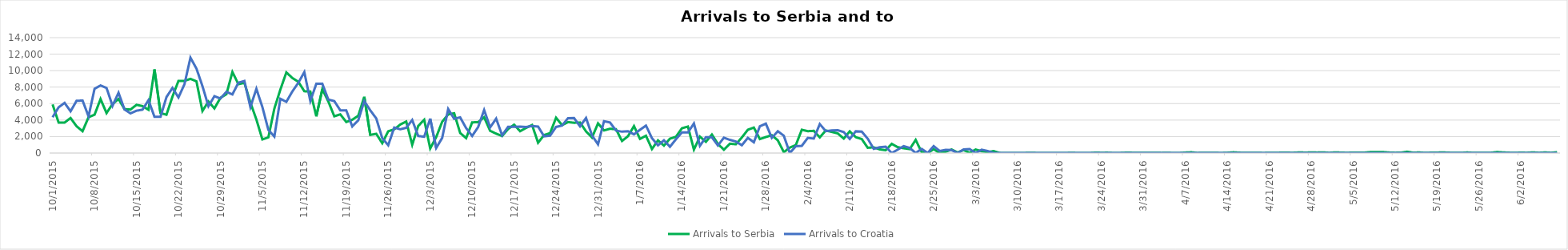
| Category | Arrivals to Serbia | Arrivals to Croatia |
|---|---|---|
| 10/1/15 | 5900 | 4344 |
| 10/2/15 | 3700 | 5546 |
| 10/3/15 | 3700 | 6086 |
| 10/4/15 | 4250 | 5065 |
| 10/5/15 | 3250 | 6338 |
| 10/6/15 | 2650 | 6370 |
| 10/7/15 | 4350 | 4446 |
| 10/8/15 | 4650 | 7798 |
| 10/9/15 | 6550 | 8201 |
| 10/10/15 | 4850 | 7896 |
| 10/11/15 | 5950 | 5732 |
| 10/12/15 | 6556 | 7317 |
| 10/13/15 | 5330 | 5286 |
| 10/14/15 | 5280 | 4814 |
| 10/15/15 | 5850 | 5138 |
| 10/16/15 | 5700 | 5260 |
| 10/17/15 | 5250 | 6415 |
| 10/18/15 | 10150 | 4390 |
| 10/19/15 | 4850 | 4388 |
| 10/20/15 | 4650 | 6793 |
| 10/21/15 | 6850 | 7900 |
| 10/22/15 | 8750 | 6748 |
| 10/23/15 | 8750 | 8348 |
| 10/24/15 | 9000 | 11570 |
| 10/25/15 | 8700 | 10249 |
| 10/26/15 | 5100 | 8128 |
| 10/27/15 | 6257 | 5683 |
| 10/28/15 | 5415 | 6900 |
| 10/29/15 | 6700 | 6615 |
| 10/30/15 | 7138 | 7429 |
| 10/31/15 | 9834 | 7110 |
| 11/1/15 | 8354 | 8534 |
| 11/2/15 | 8521 | 8746 |
| 11/3/15 | 6129 | 5573 |
| 11/4/15 | 4073 | 7792 |
| 11/5/15 | 1652 | 5587 |
| 11/6/15 | 1906 | 2809 |
| 11/7/15 | 5397 | 2000 |
| 11/8/15 | 7695 | 6579 |
| 11/9/15 | 9785 | 6214 |
| 11/10/15 | 9107 | 7474 |
| 11/11/15 | 8648 | 8524 |
| 11/12/15 | 7500 | 9823 |
| 11/13/15 | 7464 | 6314 |
| 11/14/15 | 4453 | 8405 |
| 11/15/15 | 7734 | 8415 |
| 11/16/15 | 6267 | 6490 |
| 11/17/15 | 4460 | 6304 |
| 11/18/15 | 4694 | 5180 |
| 11/19/15 | 3765 | 5167 |
| 11/20/15 | 4042 | 3230 |
| 11/21/15 | 4527 | 3977 |
| 11/22/15 | 6826 | 6305 |
| 11/23/15 | 2201 | 5184 |
| 11/24/15 | 2335 | 4203 |
| 11/25/15 | 1194 | 1808 |
| 11/26/15 | 2636 | 952 |
| 11/27/15 | 2878 | 3095 |
| 11/28/15 | 3454 | 2886 |
| 11/29/15 | 3825 | 3060 |
| 11/30/15 | 1009 | 4009 |
| 12/1/15 | 3284 | 2066 |
| 12/2/15 | 4040 | 1982 |
| 12/3/15 | 553 | 4174 |
| 12/4/15 | 1927 | 611 |
| 12/5/15 | 3799 | 1835 |
| 12/6/15 | 4686 | 5339 |
| 12/7/15 | 4823 | 4162 |
| 12/8/15 | 2437 | 4335 |
| 12/9/15 | 1807 | 3027 |
| 12/10/15 | 3723 | 2076 |
| 12/11/15 | 3747 | 3149 |
| 12/12/15 | 4339 | 5225 |
| 12/13/15 | 2698 | 3112 |
| 12/14/15 | 2353 | 4174 |
| 12/15/15 | 2067 | 2160 |
| 12/16/15 | 2916 | 3177 |
| 12/17/15 | 3438 | 3192 |
| 12/18/15 | 2649 | 3200 |
| 12/19/15 | 3052 | 3156 |
| 12/20/15 | 3405 | 3276 |
| 12/21/15 | 1253 | 3210 |
| 12/22/15 | 2186 | 2027 |
| 12/23/15 | 2415 | 2116 |
| 12/24/15 | 4279 | 3166 |
| 12/25/15 | 3390 | 3339 |
| 12/26/15 | 3757 | 4241 |
| 12/27/15 | 3674 | 4251 |
| 12/28/15 | 3708 | 3249 |
| 12/29/15 | 2629 | 4253 |
| 12/30/15 | 1879 | 2132 |
| 12/31/15 | 3602 | 1058 |
| 1/1/16 | 2745 | 3869 |
| 1/2/16 | 2947 | 3710 |
| 1/3/16 | 2889 | 2732 |
| 1/4/16 | 1462 | 2591 |
| 1/5/16 | 2041 | 2650 |
| 1/6/16 | 3273 | 2273 |
| 1/7/16 | 1715 | 2814 |
| 1/8/16 | 2100 | 3332 |
| 1/9/16 | 489 | 1799 |
| 1/10/16 | 1538 | 942 |
| 1/11/16 | 905 | 1549 |
| 1/12/16 | 1743 | 769 |
| 1/13/16 | 1973 | 1679 |
| 1/14/16 | 3006 | 2502 |
| 1/15/16 | 3213 | 2493 |
| 1/16/16 | 415 | 3579 |
| 1/17/16 | 1995 | 878 |
| 1/18/16 | 1362 | 1930 |
| 1/19/16 | 2244 | 1917 |
| 1/20/16 | 1113 | 914 |
| 1/21/16 | 397 | 1865 |
| 1/22/16 | 1134 | 1599 |
| 1/23/16 | 1064 | 1394 |
| 1/24/16 | 1895 | 946 |
| 1/25/16 | 2827 | 1847 |
| 1/26/16 | 3091 | 1309 |
| 1/27/16 | 1695 | 3256 |
| 1/28/16 | 1940 | 3565 |
| 1/29/16 | 2167 | 1843 |
| 1/30/16 | 1540 | 2641 |
| 1/31/16 | 103 | 2098 |
| 2/1/16 | 660 | 0 |
| 2/2/16 | 966 | 822 |
| 2/3/16 | 2825 | 881 |
| 2/4/16 | 2653 | 1836 |
| 2/5/16 | 2694 | 1750 |
| 2/6/16 | 1901 | 3510 |
| 2/7/16 | 2739 | 2658 |
| 2/8/16 | 2563 | 2736 |
| 2/9/16 | 2379 | 2764 |
| 2/10/16 | 1758 | 2544 |
| 2/11/16 | 2636 | 1716 |
| 2/12/16 | 1923 | 2635 |
| 2/13/16 | 1699 | 2595 |
| 2/14/16 | 641 | 1749 |
| 2/15/16 | 691 | 512 |
| 2/16/16 | 443 | 701 |
| 2/17/16 | 345 | 769 |
| 2/18/16 | 1117 | 0 |
| 2/19/16 | 713 | 408 |
| 2/20/16 | 580 | 834 |
| 2/21/16 | 476 | 630 |
| 2/22/16 | 1595 | 0 |
| 2/23/16 | 106 | 507 |
| 2/24/16 | 1 | 0 |
| 2/25/16 | 475 | 841 |
| 2/26/16 | 0 | 250 |
| 2/27/16 | 158 | 385 |
| 2/28/16 | 431 | 358 |
| 2/29/16 | 69 | 0 |
| 3/1/16 | 372 | 436 |
| 3/2/16 | 16 | 476 |
| 3/3/16 | 428 | 0 |
| 3/4/16 | 218 | 410 |
| 3/5/16 | 115 | 253 |
| 3/6/16 | 236 | 0 |
| 3/7/16 | 14 | 0 |
| 3/8/16 | 0 | 0 |
| 3/9/16 | 3 | 0 |
| 3/10/16 | 0 | 0 |
| 3/11/16 | 0 | 0 |
| 3/12/16 | 35 | 0 |
| 3/13/16 | 12 | 0 |
| 3/14/16 | 0 | 0 |
| 3/15/16 | 0 | 0 |
| 3/16/16 | 0 | 0 |
| 3/17/16 | 0 | 0 |
| 3/18/16 | 0 | 0 |
| 3/19/16 | 30 | 0 |
| 3/20/16 | 0 | 0 |
| 3/21/16 | 0 | 0 |
| 3/22/16 | 0 | 0 |
| 3/23/16 | 49 | 0 |
| 3/24/16 | 31 | 0 |
| 3/25/16 | 40 | 0 |
| 3/26/16 | 0 | 0 |
| 3/27/16 | 4 | 0 |
| 3/28/16 | 42 | 0 |
| 3/29/16 | 37 | 0 |
| 3/30/16 | 21 | 0 |
| 3/31/16 | 14 | 0 |
| 4/1/16 | 28 | 0 |
| 4/2/16 | 32 | 0 |
| 4/3/16 | 10 | 0 |
| 4/4/16 | 28 | 0 |
| 4/5/16 | 0 | 0 |
| 4/6/16 | 4 | 0 |
| 4/7/16 | 58 | 0 |
| 4/8/16 | 93 | 0 |
| 4/9/16 | 8 | 0 |
| 4/10/16 | 30 | 0 |
| 4/11/16 | 34 | 0 |
| 4/12/16 | 22 | 0 |
| 4/13/16 | 3 | 0 |
| 4/14/16 | 34 | 0 |
| 4/15/16 | 90 | 0 |
| 4/16/16 | 41 | 0 |
| 4/17/16 | 15 | 0 |
| 4/18/16 | 17 | 0 |
| 4/19/16 | 34 | 0 |
| 4/20/16 | 5 | 0 |
| 4/21/16 | 31 | 0 |
| 4/22/16 | 19 | 0 |
| 4/23/16 | 45 | 0 |
| 4/24/16 | 38 | 0 |
| 4/25/16 | 34 | 0 |
| 4/26/16 | 73 | 0 |
| 4/27/16 | 54 | 0 |
| 4/28/16 | 69 | 0 |
| 4/29/16 | 59 | 0 |
| 4/30/16 | 80 | 0 |
| 5/1/16 | 26 | 0 |
| 5/2/16 | 81 | 0 |
| 5/3/16 | 50 | 0 |
| 5/4/16 | 25 | 0 |
| 5/5/16 | 58 | 0 |
| 5/6/16 | 49 | 0 |
| 5/7/16 | 59 | 0 |
| 5/8/16 | 128 | 0 |
| 5/9/16 | 113 | 0 |
| 5/10/16 | 119 | 0 |
| 5/11/16 | 62 | 0 |
| 5/12/16 | 33 | 0 |
| 5/13/16 | 51 | 0 |
| 5/14/16 | 161 | 0 |
| 5/15/16 | 45 | 0 |
| 5/16/16 | 71 | 0 |
| 5/17/16 | 17 | 0 |
| 5/18/16 | 44 | 0 |
| 5/19/16 | 55 | 0 |
| 5/20/16 | 74 | 0 |
| 5/21/16 | 39 | 0 |
| 5/22/16 | 16 | 0 |
| 5/23/16 | 15 | 0 |
| 5/24/16 | 68 | 0 |
| 5/25/16 | 23 | 0 |
| 5/26/16 | 15 | 0 |
| 5/27/16 | 20 | 0 |
| 5/28/16 | 35 | 0 |
| 5/29/16 | 121 | 0 |
| 5/30/16 | 75 | 0 |
| 5/31/16 | 37 | 0 |
| 6/1/16 | 29 | 0 |
| 6/2/16 | 43 | 0 |
| 6/3/16 | 32 | 0 |
| 6/4/16 | 80 | 0 |
| 6/5/16 | 26 | 0 |
| 6/6/16 | 74 | 0 |
| 6/7/16 | 28 | 0 |
| 6/8/16 | 101 | 0 |